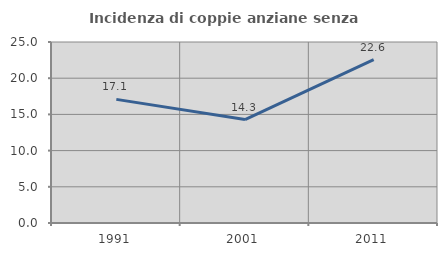
| Category | Incidenza di coppie anziane senza figli  |
|---|---|
| 1991.0 | 17.073 |
| 2001.0 | 14.286 |
| 2011.0 | 22.581 |